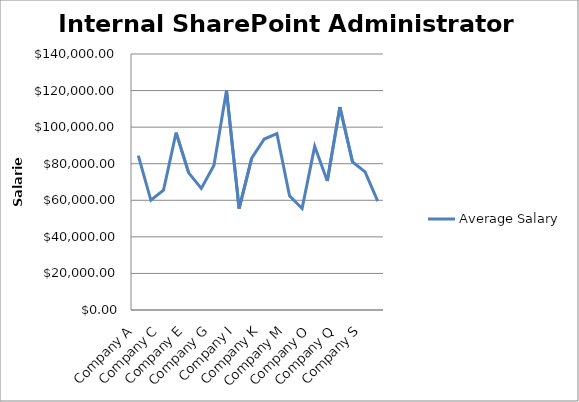
| Category | Average Salary |
|---|---|
| Company A | 84464 |
| Company B | 60000 |
| Company C | 65500 |
| Company D | 97000 |
| Company E | 75000 |
| Company F | 66500 |
| Company G | 79000 |
| Company H | 120000 |
| Company I | 55500 |
| Company J | 83000 |
| Company K | 93500 |
| Company L | 96500 |
| Company M | 62500 |
| Company N | 55500 |
| Company O | 89500 |
| Company P | 70500 |
| Company Q | 111000 |
| Company R | 81000 |
| Company S | 75500 |
| Company T | 59500 |